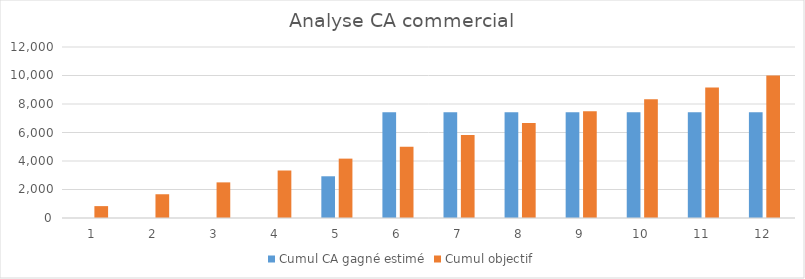
| Category | Cumul CA gagné estimé | Cumul objectif |
|---|---|---|
| 0 | 0 | 833.333 |
| 1 | 0 | 1666.667 |
| 2 | 0 | 2500 |
| 3 | 0 | 3333.333 |
| 4 | 2928 | 4166.667 |
| 5 | 7428 | 5000 |
| 6 | 7428 | 5833.333 |
| 7 | 7428 | 6666.667 |
| 8 | 7428 | 7500 |
| 9 | 7428 | 8333.333 |
| 10 | 7428 | 9166.667 |
| 11 | 7428 | 10000 |